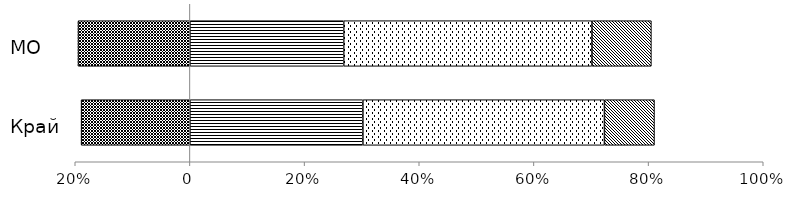
| Category | Пониженный | Недостаточный | Базовый | Повышенный |
|---|---|---|---|---|
|  | 0.302 | -0.19 | 0.421 | 0.087 |
|  | 0.268 | -0.195 | 0.433 | 0.104 |